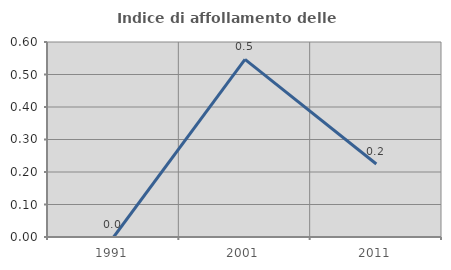
| Category | Indice di affollamento delle abitazioni  |
|---|---|
| 1991.0 | 0 |
| 2001.0 | 0.546 |
| 2011.0 | 0.225 |